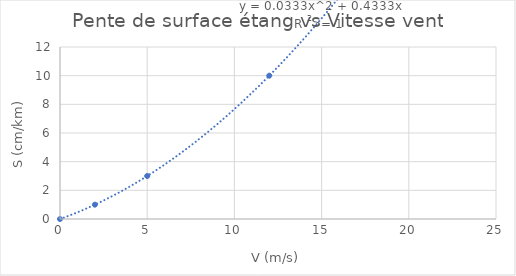
| Category | Series 0 |
|---|---|
| 0.0 | 0 |
| 2.0 | 1 |
| 5.0 | 3 |
| 12.0 | 10 |